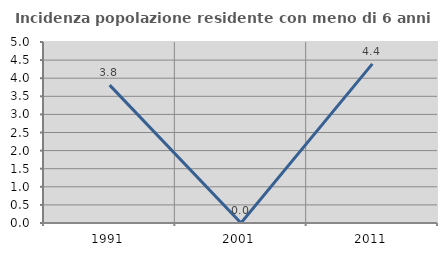
| Category | Incidenza popolazione residente con meno di 6 anni |
|---|---|
| 1991.0 | 3.81 |
| 2001.0 | 0 |
| 2011.0 | 4.396 |